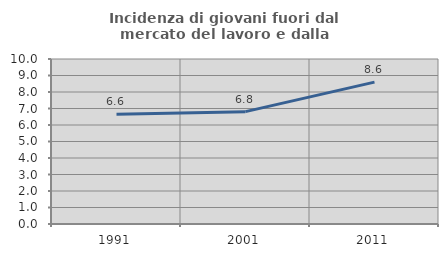
| Category | Incidenza di giovani fuori dal mercato del lavoro e dalla formazione  |
|---|---|
| 1991.0 | 6.645 |
| 2001.0 | 6.809 |
| 2011.0 | 8.597 |